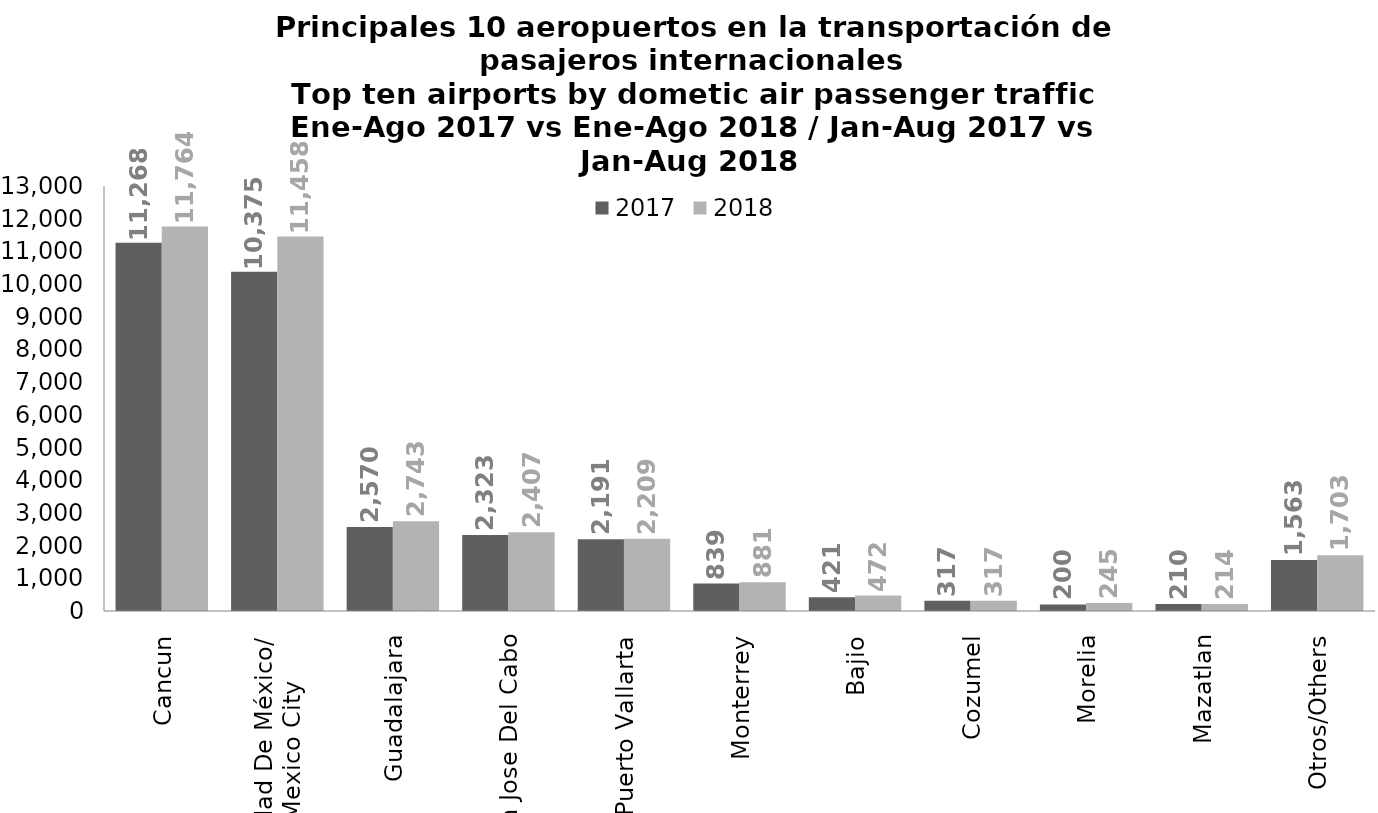
| Category | 2017 | 2018 |
|---|---|---|
| Cancun | 11267.814 | 11763.931 |
| Ciudad De México/
Mexico City | 10374.567 | 11458.227 |
| Guadalajara | 2570.01 | 2743.179 |
| San Jose Del Cabo | 2322.625 | 2406.995 |
| Puerto Vallarta | 2191.484 | 2209.118 |
| Monterrey | 839.024 | 880.951 |
| Bajio | 421.257 | 471.528 |
| Cozumel | 317.036 | 316.546 |
| Morelia | 200.129 | 244.907 |
| Mazatlan | 210.496 | 213.828 |
| Otros/Others | 1562.852 | 1703.034 |